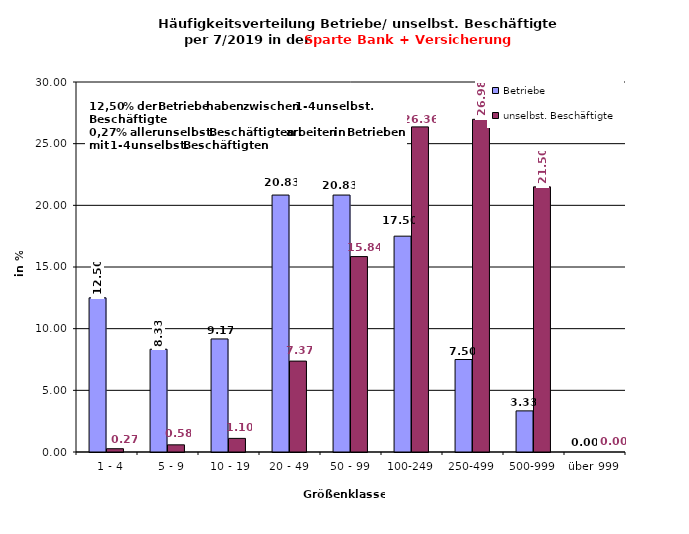
| Category | Betriebe | unselbst. Beschäftigte |
|---|---|---|
|   1 - 4 | 12.5 | 0.266 |
|   5 - 9 | 8.333 | 0.581 |
|  10 - 19 | 9.167 | 1.104 |
| 20 - 49 | 20.833 | 7.371 |
| 50 - 99 | 20.833 | 15.845 |
| 100-249 | 17.5 | 26.361 |
| 250-499 | 7.5 | 26.975 |
| 500-999 | 3.333 | 21.497 |
| über 999 | 0 | 0 |